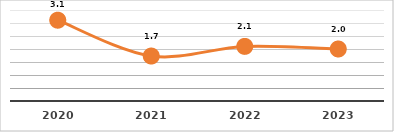
| Category | COBERTURA DE BECADOS EXTERNOS (%)
PRIMER TRIMESTRE, EJERCICIO 2023 |
|---|---|
| 2020.0 | 3.108 |
| 2021.0 | 1.73 |
| 2022.0 | 2.1 |
| 2023.0 | 2 |